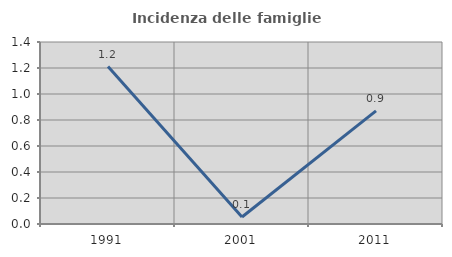
| Category | Incidenza delle famiglie numerose |
|---|---|
| 1991.0 | 1.211 |
| 2001.0 | 0.054 |
| 2011.0 | 0.87 |